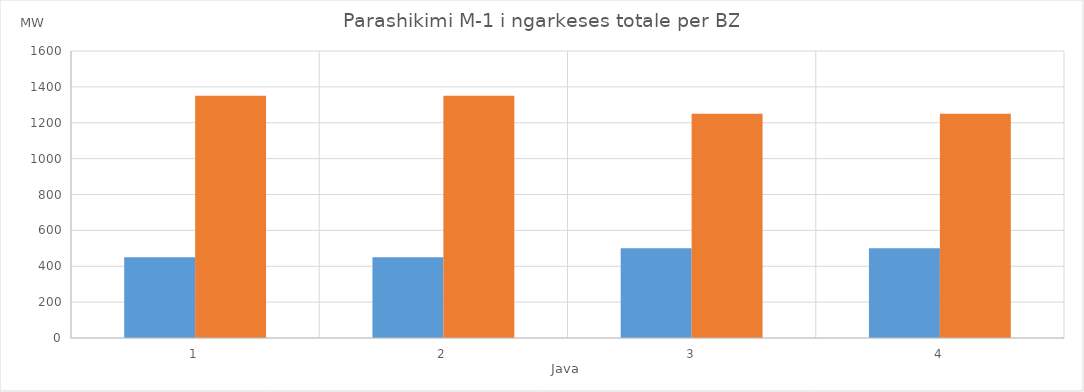
| Category | Min (MW) | Max (MW) |
|---|---|---|
| 0 | 450 | 1350 |
| 1 | 450 | 1350 |
| 2 | 500 | 1250 |
| 3 | 500 | 1250 |